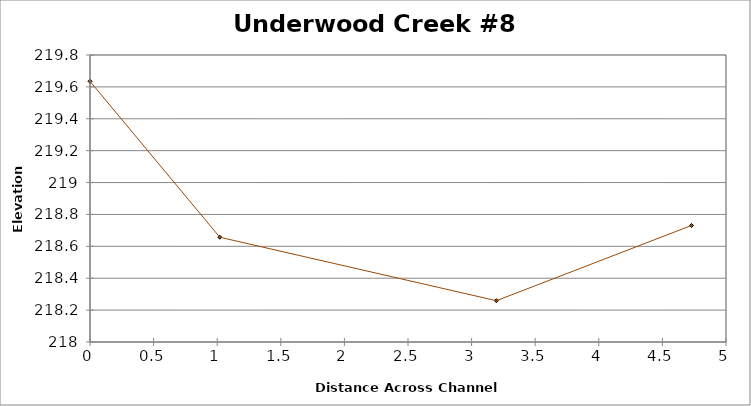
| Category | Series 0 |
|---|---|
| 0.0 | 219.635 |
| 1.0204410804636743 | 218.657 |
| 3.194802810568525 | 218.259 |
| 4.72920765040324 | 218.731 |